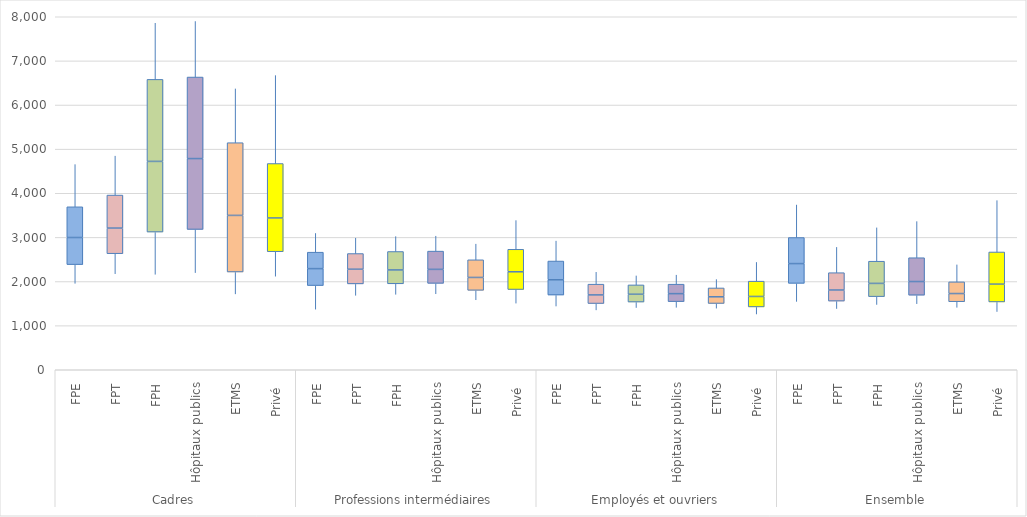
| Category | D1 | Diff Q1-D1 | Diff Med-Q1 | Diff Q3-Med | Diff D9-Q3 |
|---|---|---|---|---|---|
| 0 | 1958 | 425 | 614 | 696 | 968 |
| 1 | 2176 | 454 | 580 | 749 | 893 |
| 2 | 2163 | 958 | 1601 | 1859 | 1283 |
| 3 | 2201 | 979 | 1606 | 1848 | 1270 |
| 4 | 1719 | 497 | 1282 | 1648 | 1230 |
| 5 | 2119 | 556 | 765 | 1234 | 2004 |
| 6 | 1372 | 536 | 384 | 373 | 435 |
| 7 | 1686 | 260 | 332 | 356 | 359 |
| 8 | 1709 | 239 | 314 | 418 | 349 |
| 9 | 1722 | 236 | 317 | 414 | 349 |
| 10 | 1586 | 214 | 292 | 400 | 366 |
| 11 | 1509 | 309 | 402 | 510 | 662 |
| 12 | 1443 | 251 | 345 | 425 | 463 |
| 13 | 1356 | 145 | 195 | 244 | 280 |
| 14 | 1409 | 126 | 176 | 212 | 215 |
| 15 | 1414 | 130 | 181 | 215 | 215 |
| 16 | 1395 | 107 | 151 | 201 | 201 |
| 17 | 1263 | 161 | 237 | 347 | 436 |
| 18 | 1548 | 410 | 448 | 591 | 747 |
| 19 | 1387 | 169 | 251 | 393 | 585 |
| 20 | 1479 | 178 | 300 | 503 | 767 |
| 21 | 1497 | 193 | 309 | 540 | 830 |
| 22 | 1414 | 128 | 185 | 265 | 396 |
| 23 | 1319 | 218 | 403 | 729 | 1175 |